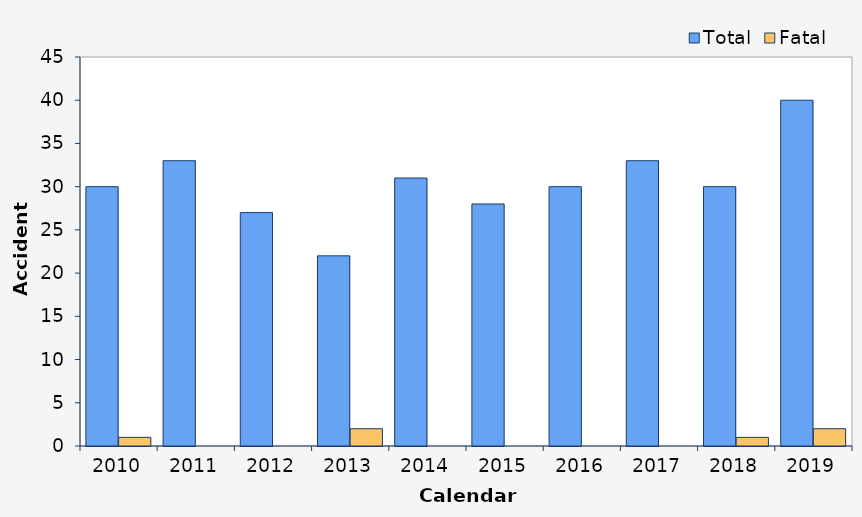
| Category | Total | Fatal |
|---|---|---|
| 2010.0 | 30 | 1 |
| 2011.0 | 33 | 0 |
| 2012.0 | 27 | 0 |
| 2013.0 | 22 | 2 |
| 2014.0 | 31 | 0 |
| 2015.0 | 28 | 0 |
| 2016.0 | 30 | 0 |
| 2017.0 | 33 | 0 |
| 2018.0 | 30 | 1 |
| 2019.0 | 40 | 2 |